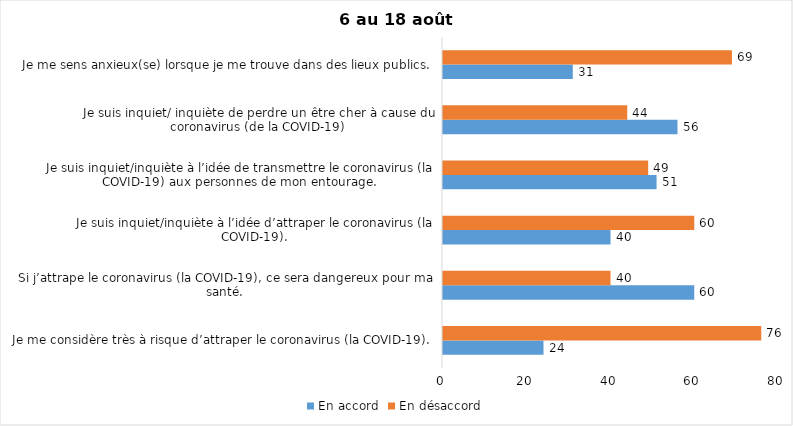
| Category | En accord | En désaccord |
|---|---|---|
| Je me considère très à risque d’attraper le coronavirus (la COVID-19). | 24 | 76 |
| Si j’attrape le coronavirus (la COVID-19), ce sera dangereux pour ma santé. | 60 | 40 |
| Je suis inquiet/inquiète à l’idée d’attraper le coronavirus (la COVID-19). | 40 | 60 |
| Je suis inquiet/inquiète à l’idée de transmettre le coronavirus (la COVID-19) aux personnes de mon entourage. | 51 | 49 |
| Je suis inquiet/ inquiète de perdre un être cher à cause du coronavirus (de la COVID-19) | 56 | 44 |
| Je me sens anxieux(se) lorsque je me trouve dans des lieux publics. | 31 | 69 |